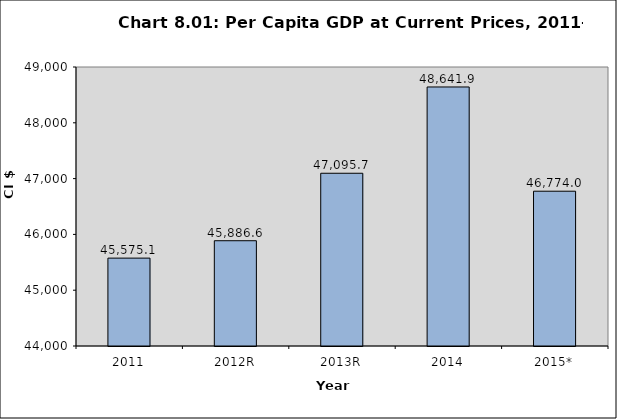
| Category | Series 0 |
|---|---|
| 2011 | 45575.1 |
| 2012R | 45886.6 |
| 2013R | 47095.7 |
| 2014 | 48641.9 |
| 2015* | 46774 |